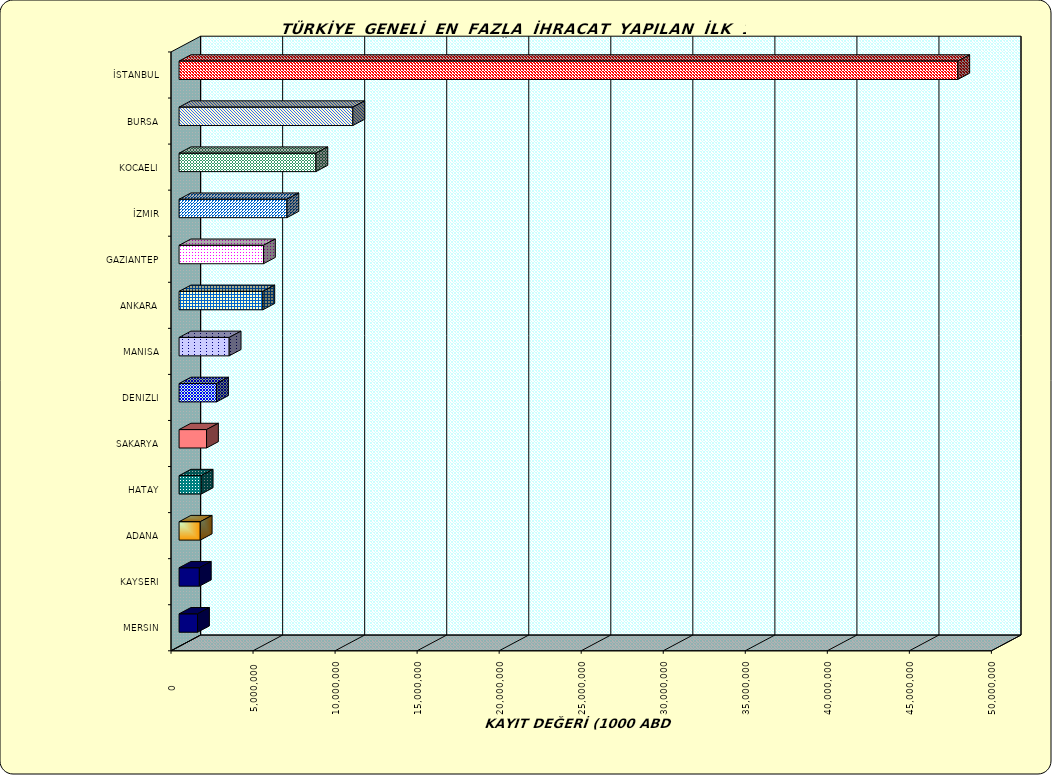
| Category | Series 0 |
|---|---|
| İSTANBUL | 47460990.779 |
| BURSA | 10591319.954 |
| KOCAELI | 8340147.05 |
| İZMIR | 6573044.312 |
| GAZIANTEP | 5144850.392 |
| ANKARA | 5105327.156 |
| MANISA | 3053500.767 |
| DENIZLI | 2284443.325 |
| SAKARYA | 1673170.021 |
| HATAY | 1348721.925 |
| ADANA | 1291050.044 |
| KAYSERI | 1235658.565 |
| MERSIN | 1125562.213 |